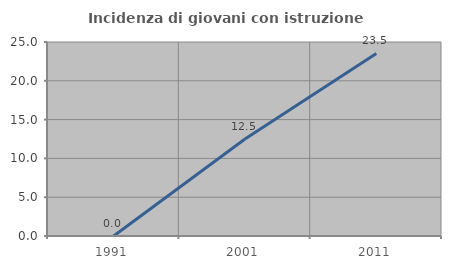
| Category | Incidenza di giovani con istruzione universitaria |
|---|---|
| 1991.0 | 0 |
| 2001.0 | 12.5 |
| 2011.0 | 23.529 |